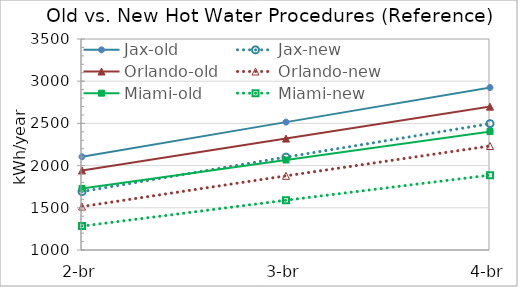
| Category | Jax-old | Jax-new | Orlando-old | Orlando-new | Miami-old | Miami-new |
|---|---|---|---|---|---|---|
| 2-br | 2105.238 | 1692.44 | 1942.1 | 1514.59 | 1729.873 | 1283.103 |
| 3-br | 2515.159 | 2100.805 | 2320.265 | 1878.843 | 2066.466 | 1589.609 |
| 4-br | 2925.08 | 2496.87 | 2698.431 | 2232.211 | 2403.059 | 1887.079 |